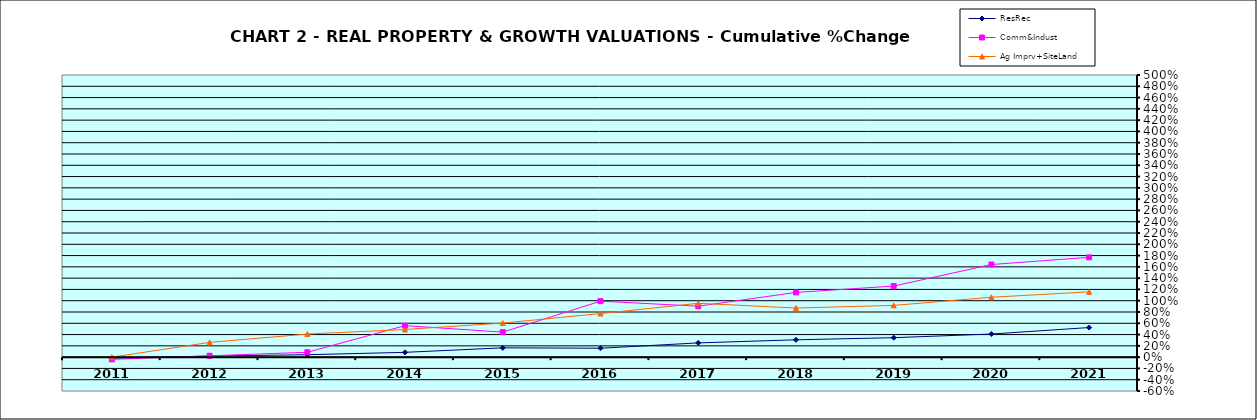
| Category | ResRec | Comm&Indust | Ag Imprv+SiteLand |
|---|---|---|---|
| 2011.0 | -0.018 | -0.039 | 0 |
| 2012.0 | 0.018 | 0.024 | 0.262 |
| 2013.0 | 0.043 | 0.086 | 0.409 |
| 2014.0 | 0.085 | 0.558 | 0.49 |
| 2015.0 | 0.165 | 0.443 | 0.604 |
| 2016.0 | 0.158 | 0.992 | 0.772 |
| 2017.0 | 0.252 | 0.903 | 0.954 |
| 2018.0 | 0.307 | 1.147 | 0.871 |
| 2019.0 | 0.345 | 1.26 | 0.917 |
| 2020.0 | 0.41 | 1.641 | 1.061 |
| 2021.0 | 0.525 | 1.769 | 1.157 |